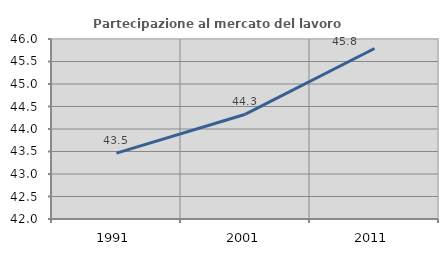
| Category | Partecipazione al mercato del lavoro  femminile |
|---|---|
| 1991.0 | 43.465 |
| 2001.0 | 44.329 |
| 2011.0 | 45.789 |